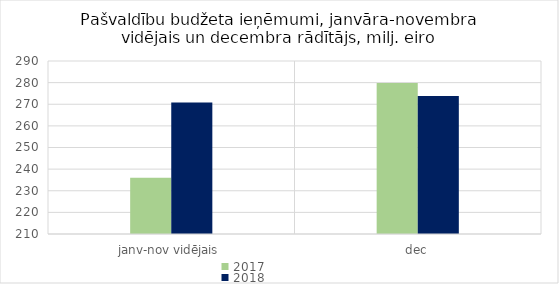
| Category | 2017 | 2018 |
|---|---|---|
| janv-nov vidējais | 236015.636 | 270777.956 |
| dec | 279855.963 | 273764.648 |